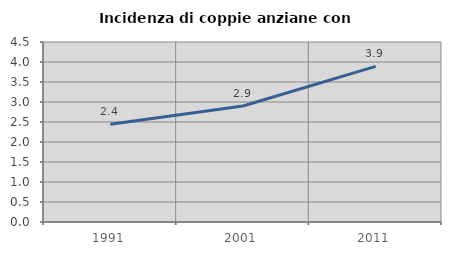
| Category | Incidenza di coppie anziane con figli |
|---|---|
| 1991.0 | 2.441 |
| 2001.0 | 2.899 |
| 2011.0 | 3.889 |